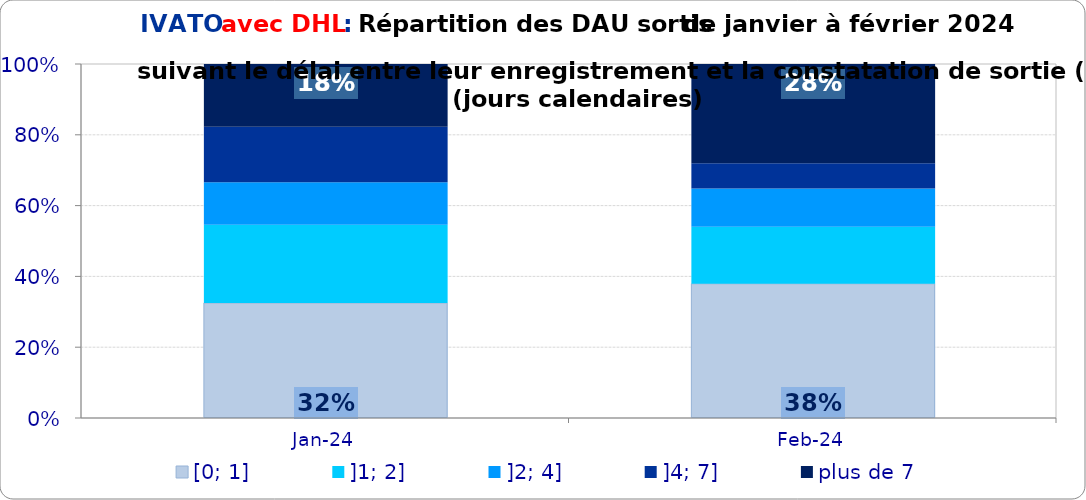
| Category | [0; 1] | ]1; 2] | ]2; 4] | ]4; 7] | plus de 7 |
|---|---|---|---|---|---|
| 2024-01-01 | 0.325 | 0.221 | 0.12 | 0.157 | 0.177 |
| 2024-02-01 | 0.379 | 0.161 | 0.108 | 0.071 | 0.28 |